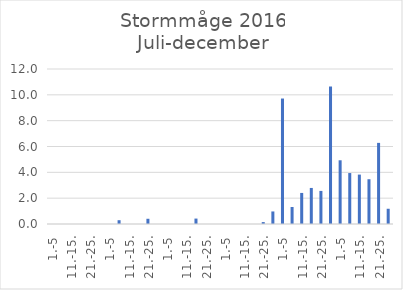
| Category | Series 0 |
|---|---|
| 1.-5 | 0 |
| 6.-10. | 0 |
| 11.-15. | 0 |
| 16.-20. | 0 |
| 21.-25. | 0 |
| 26.-31. | 0 |
| 1.-5 | 0 |
| 6.-10. | 0.294 |
| 11.-15. | 0 |
| 16.-20. | 0 |
| 21.-25. | 0.404 |
| 26.-31. | 0 |
| 1.-5 | 0 |
| 6.-10. | 0 |
| 11.-15. | 0 |
| 16.-20. | 0.42 |
| 21.-25. | 0 |
| 26.-30. | 0 |
| 1.-5 | 0 |
| 6.-10. | 0 |
| 11.-15. | 0 |
| 16.-20. | 0 |
| 21.-25. | 0.148 |
| 26.-31. | 0.971 |
| 1.-5 | 9.714 |
| 6.-10. | 1.316 |
| 11.-15. | 2.405 |
| 16.-20. | 2.791 |
| 21.-25. | 2.561 |
| 26.-30. | 10.645 |
| 1.-5 | 4.933 |
| 6.-10. | 3.944 |
| 11.-15. | 3.825 |
| 16.-20. | 3.467 |
| 21.-25. | 6.281 |
| 26.-31. | 1.18 |